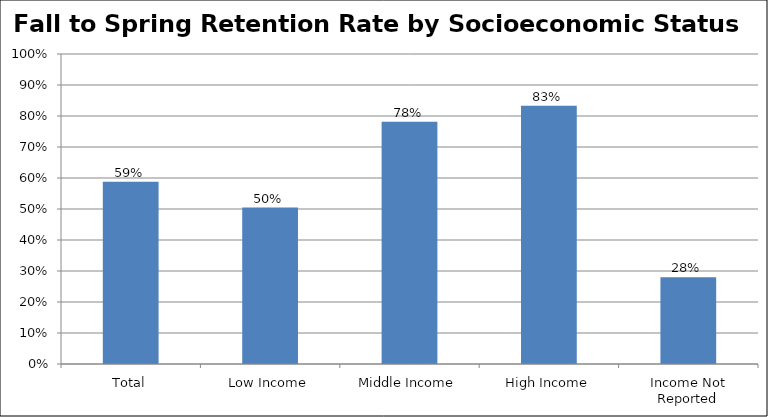
| Category | Fall to Spring Retention Rate for POS Students |
|---|---|
| Total | 0.588 |
| Low Income | 0.505 |
| Middle Income | 0.781 |
| High Income | 0.833 |
| Income Not Reported | 0.28 |